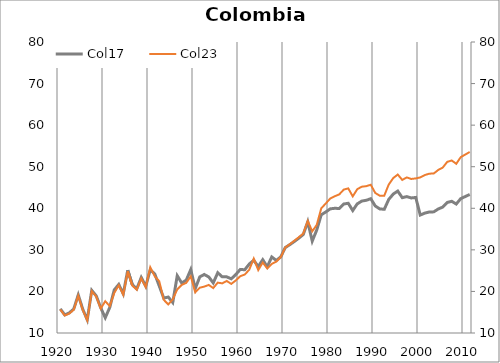
| Category | Col17 |
|---|---|
| 1920.0 | 15.814 |
| 1921.0 | 14.358 |
| 1922.0 | 14.832 |
| 1923.0 | 15.775 |
| 1924.0 | 19.165 |
| 1925.0 | 15.726 |
| 1926.0 | 13.173 |
| 1927.0 | 20.263 |
| 1928.0 | 18.932 |
| 1929.0 | 16.049 |
| 1930.0 | 13.667 |
| 1931.0 | 16.144 |
| 1932.0 | 20.364 |
| 1933.0 | 21.687 |
| 1934.0 | 19.413 |
| 1935.0 | 25.104 |
| 1936.0 | 21.677 |
| 1937.0 | 20.615 |
| 1938.0 | 23.362 |
| 1939.0 | 21.255 |
| 1940.0 | 25.194 |
| 1941.0 | 24.217 |
| 1942.0 | 21.308 |
| 1943.0 | 18.392 |
| 1944.0 | 18.652 |
| 1945.0 | 17.33 |
| 1946.0 | 23.773 |
| 1947.0 | 22.005 |
| 1948.0 | 22.728 |
| 1949.0 | 25.257 |
| 1950.0 | 20.67 |
| 1951.0 | 23.497 |
| 1952.0 | 24.078 |
| 1953.0 | 23.483 |
| 1954.0 | 22.054 |
| 1955.0 | 24.496 |
| 1956.0 | 23.506 |
| 1957.0 | 23.501 |
| 1958.0 | 23.035 |
| 1959.0 | 24.053 |
| 1960.0 | 25.294 |
| 1961.0 | 25.214 |
| 1962.0 | 26.583 |
| 1963.0 | 27.497 |
| 1964.0 | 25.976 |
| 1965.0 | 27.633 |
| 1966.0 | 25.936 |
| 1967.0 | 28.293 |
| 1968.0 | 27.465 |
| 1969.0 | 28.3 |
| 1970.0 | 30.552 |
| 1971.0 | 31.244 |
| 1972.0 | 31.995 |
| 1973.0 | 32.809 |
| 1974.0 | 33.689 |
| 1975.0 | 36.768 |
| 1976.0 | 32.106 |
| 1977.0 | 34.789 |
| 1978.0 | 38.439 |
| 1979.0 | 39.106 |
| 1980.0 | 39.865 |
| 1981.0 | 39.999 |
| 1982.0 | 39.947 |
| 1983.0 | 41.027 |
| 1984.0 | 41.21 |
| 1985.0 | 39.463 |
| 1986.0 | 41.061 |
| 1987.0 | 41.73 |
| 1988.0 | 41.926 |
| 1989.0 | 42.3 |
| 1990.0 | 40.557 |
| 1991.0 | 39.851 |
| 1992.0 | 39.755 |
| 1993.0 | 42.137 |
| 1994.0 | 43.417 |
| 1995.0 | 44.145 |
| 1996.0 | 42.55 |
| 1997.0 | 42.811 |
| 1998.0 | 42.488 |
| 1999.0 | 42.607 |
| 2000.0 | 38.373 |
| 2001.0 | 38.834 |
| 2002.0 | 39.103 |
| 2003.0 | 39.141 |
| 2004.0 | 39.832 |
| 2005.0 | 40.292 |
| 2006.0 | 41.405 |
| 2007.0 | 41.674 |
| 2008.0 | 41.021 |
| 2009.0 | 42.326 |
| 2010.0 | 42.825 |
| 2011.0 | 43.33 |